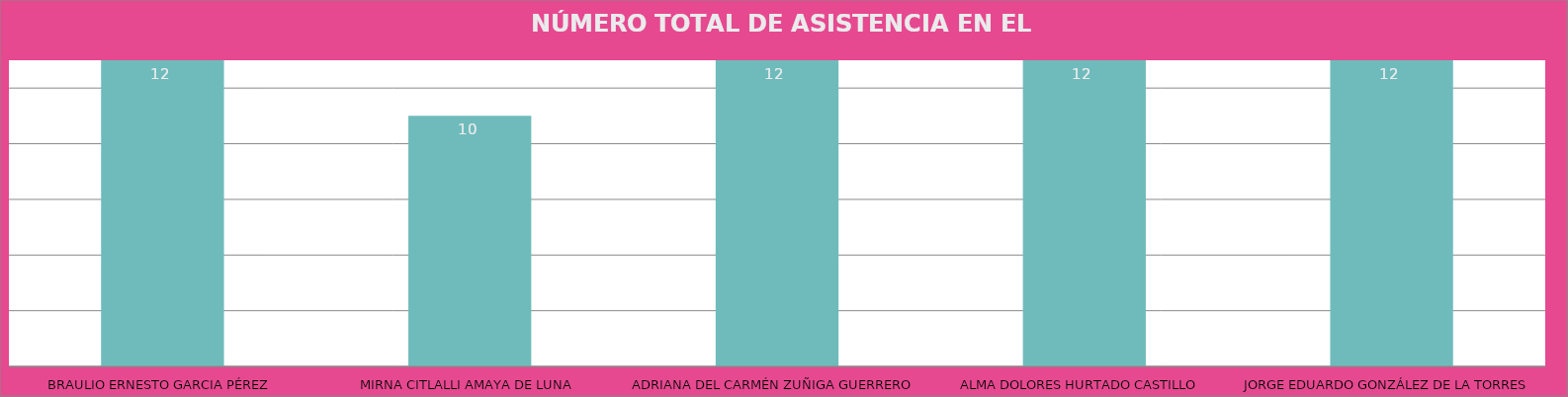
| Category | BRAULIO ERNESTO GARCIA PÉREZ |
|---|---|
| BRAULIO ERNESTO GARCIA PÉREZ | 12 |
| MIRNA CITLALLI AMAYA DE LUNA | 10 |
| ADRIANA DEL CARMÉN ZUÑIGA GUERRERO | 12 |
| ALMA DOLORES HURTADO CASTILLO | 12 |
| JORGE EDUARDO GONZÁLEZ DE LA TORRES | 12 |